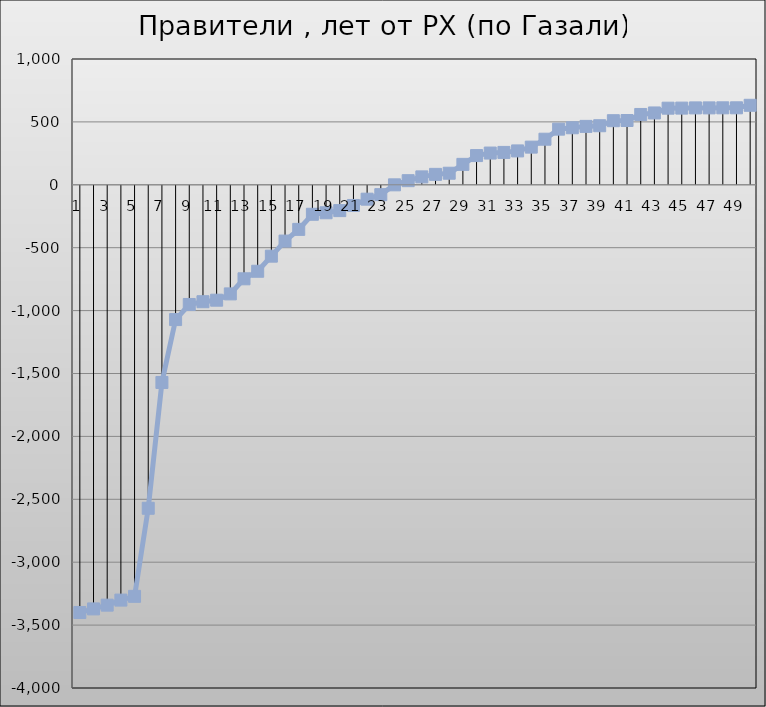
| Category | Лет от РХ |
|---|---|
| 0 | -3400 |
| 1 | -3371.345 |
| 2 | -3341.345 |
| 3 | -3301.345 |
| 4 | -3271.345 |
| 5 | -2571.345 |
| 6 | -1571.345 |
| 7 | -1071.345 |
| 8 | -951.345 |
| 9 | -929.345 |
| 10 | -917.265 |
| 11 | -867.265 |
| 12 | -747.265 |
| 13 | -687.265 |
| 14 | -567.265 |
| 15 | -447.265 |
| 16 | -354.265 |
| 17 | -234.265 |
| 18 | -222.265 |
| 19 | -205.265 |
| 20 | -164.265 |
| 21 | -114.265 |
| 22 | -78.265 |
| 23 | -0.265 |
| 24 | 32.735 |
| 25 | 62.985 |
| 26 | 82.985 |
| 27 | 91.985 |
| 28 | 162.405 |
| 29 | 232.405 |
| 30 | 252.405 |
| 31 | 257.405 |
| 32 | 269.405 |
| 33 | 299.405 |
| 34 | 362.405 |
| 35 | 442.405 |
| 36 | 453.405 |
| 37 | 464.405 |
| 38 | 469.575 |
| 39 | 509.575 |
| 40 | 511.075 |
| 41 | 559.075 |
| 42 | 571.075 |
| 43 | 609.075 |
| 44 | 609.655 |
| 45 | 611.255 |
| 46 | 611.42 |
| 47 | 611.92 |
| 48 | 612 |
| 49 | 632 |